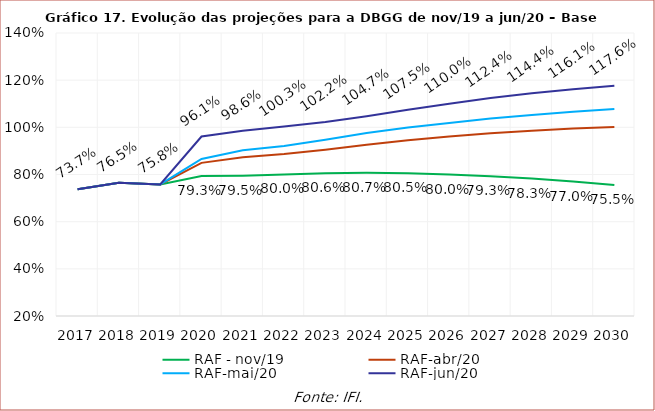
| Category | RAF - nov/19 | RAF-abr/20 | RAF-mai/20 | RAF-jun/20 |
|---|---|---|---|---|
| 2017.0 | 0.737 | 0.737 | 0.737 | 0.737 |
| 2018.0 | 0.765 | 0.765 | 0.765 | 0.765 |
| 2019.0 | 0.758 | 0.758 | 0.758 | 0.758 |
| 2020.0 | 0.793 | 0.849 | 0.866 | 0.961 |
| 2021.0 | 0.795 | 0.873 | 0.902 | 0.986 |
| 2022.0 | 0.8 | 0.887 | 0.921 | 1.003 |
| 2023.0 | 0.806 | 0.905 | 0.948 | 1.022 |
| 2024.0 | 0.807 | 0.927 | 0.976 | 1.047 |
| 2025.0 | 0.805 | 0.945 | 0.999 | 1.075 |
| 2026.0 | 0.8 | 0.961 | 1.019 | 1.1 |
| 2027.0 | 0.793 | 0.975 | 1.037 | 1.124 |
| 2028.0 | 0.783 | 0.986 | 1.052 | 1.144 |
| 2029.0 | 0.77 | 0.995 | 1.066 | 1.161 |
| 2030.0 | 0.755 | 1.002 | 1.077 | 1.176 |